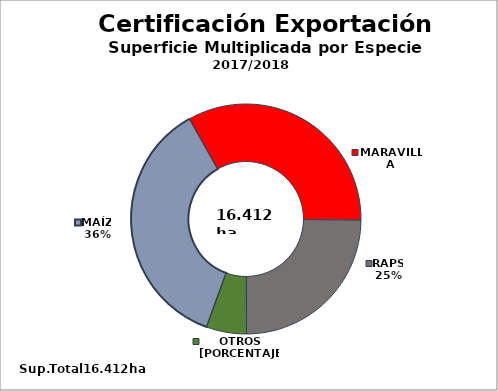
| Category | Series 0 |
|---|---|
| MAÍZ | 5960.06 |
| MARAVILLA | 5462.72 |
| RAPS | 4067.57 |
| OTROS (Avena, Avena Estrigosa, Calabaza, Lupino Azul, Lupino Blanco, Mostaza de Abisinia, Soya, Tabaco, Trébol Encarnado, Trébol Rosado) | 921.98 |